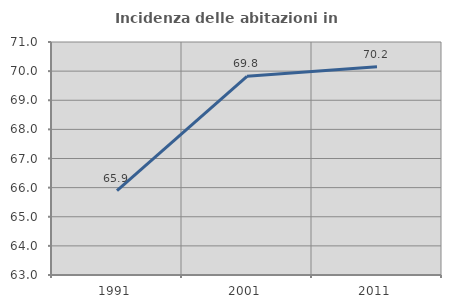
| Category | Incidenza delle abitazioni in proprietà  |
|---|---|
| 1991.0 | 65.901 |
| 2001.0 | 69.824 |
| 2011.0 | 70.151 |